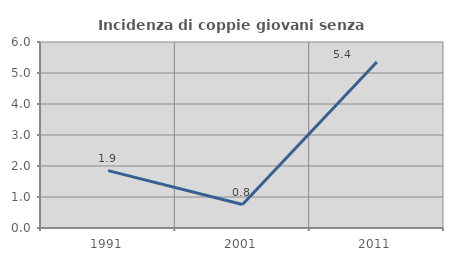
| Category | Incidenza di coppie giovani senza figli |
|---|---|
| 1991.0 | 1.852 |
| 2001.0 | 0.758 |
| 2011.0 | 5.357 |